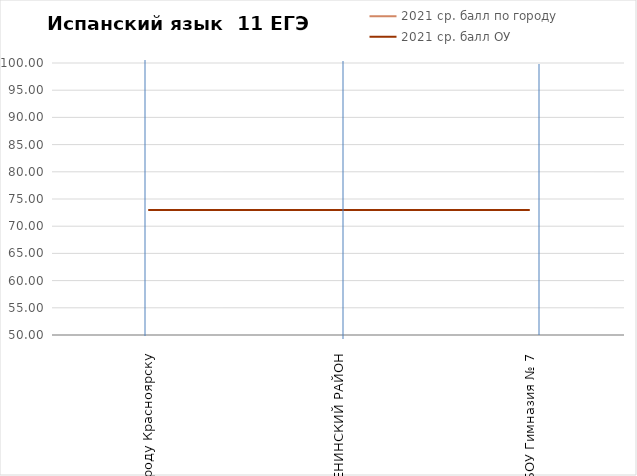
| Category | 2021 ср. балл по городу | 2021 ср. балл ОУ |
|---|---|---|
| по городу Красноярску | 73 | 73 |
| ЛЕНИНСКИЙ РАЙОН | 73 | 73 |
| МБОУ Гимназия № 7 | 73 | 73 |